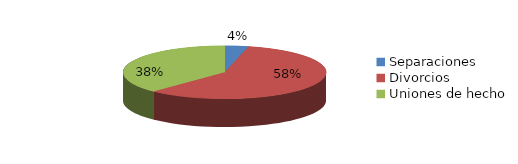
| Category | Series 0 |
|---|---|
| Separaciones | 63 |
| Divorcios | 976 |
| Uniones de hecho | 632 |